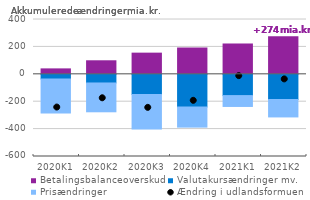
| Category | Betalingsbalanceoverskud | Valutakursændringer mv. | Prisændringer |
|---|---|---|---|
| 2020K1 | 39.514 | -34.063 | -248.177 |
| 2020K2 | 98.673 | -63.345 | -210.34 |
| 2020K3 | 154.443 | -146.727 | -252.586 |
| 2020K4 | 191.933 | -238.705 | -146.849 |
| 2021K1 | 221.247 | -155.399 | -79.253 |
| 2021K2 | 273.913 | -184.061 | -127.043 |